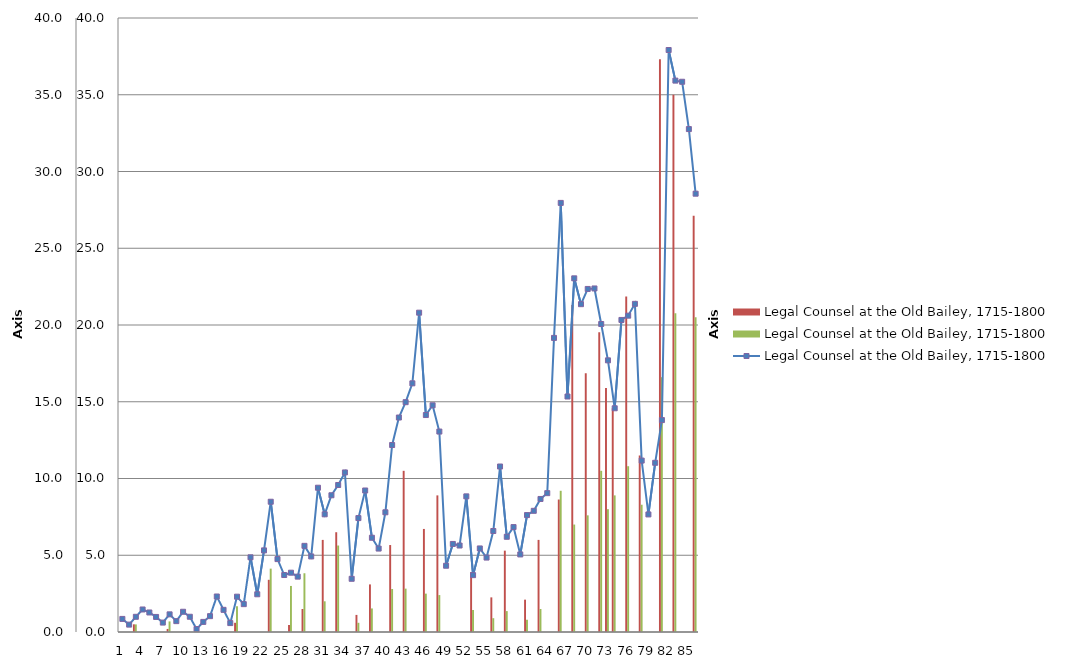
| Category | Legal Counsel at the Old Bailey, 1715-1800 | Series 2 |
|---|---|---|
| 0 | 0 |  |
| 1 | 0 |  |
| 2 | 0.495 |  |
| 3 | 0 |  |
| 4 | 0 |  |
| 5 | 0 |  |
| 6 | 0 |  |
| 7 | 0.69 |  |
| 8 | 0 |  |
| 9 | 0 |  |
| 10 | 0 |  |
| 11 | 0 |  |
| 12 | 0 |  |
| 13 | 0 |  |
| 14 | 0 |  |
| 15 | 0 |  |
| 16 | 0 |  |
| 17 | 1.674 |  |
| 18 | 0 |  |
| 19 | 0 |  |
| 20 | 0 |  |
| 21 | 0 |  |
| 22 | 4.128 |  |
| 23 | 0 |  |
| 24 | 0 |  |
| 25 | 3 |  |
| 26 | 0 |  |
| 27 | 3.827 |  |
| 28 | 0 |  |
| 29 | 0 |  |
| 30 | 2 |  |
| 31 | 0 |  |
| 32 | 5.634 |  |
| 33 | 0 |  |
| 34 | 0 |  |
| 35 | 0.6 |  |
| 36 | 0 |  |
| 37 | 1.535 |  |
| 38 | 0 |  |
| 39 | 0 |  |
| 40 | 2.8 |  |
| 41 | 0 |  |
| 42 | 2.825 |  |
| 43 | 0 |  |
| 44 | 0 |  |
| 45 | 2.5 |  |
| 46 | 0 |  |
| 47 | 2.405 |  |
| 48 | 0 |  |
| 49 | 0 |  |
| 50 | 0 |  |
| 51 | 0 |  |
| 52 | 1.44 |  |
| 53 | 0 |  |
| 54 | 0 |  |
| 55 | 0.9 |  |
| 56 | 0 |  |
| 57 | 1.362 |  |
| 58 | 0 |  |
| 59 | 0 |  |
| 60 | 0.8 |  |
| 61 | 0 |  |
| 62 | 1.5 |  |
| 63 | 0 |  |
| 64 | 0 |  |
| 65 | 9.2 |  |
| 66 | 0 |  |
| 67 | 7 |  |
| 68 | 0 |  |
| 69 | 7.6 |  |
| 70 | 0 |  |
| 71 | 10.5 |  |
| 72 | 8 |  |
| 73 | 8.9 |  |
| 74 | 0 |  |
| 75 | 10.8 |  |
| 76 | 0 |  |
| 77 | 8.291 |  |
| 78 | 0 |  |
| 79 | 0 |  |
| 80 | 16.6 |  |
| 81 | 0 |  |
| 82 | 20.758 |  |
| 83 | 0 |  |
| 84 | 0 |  |
| 85 | 20.5 |  |